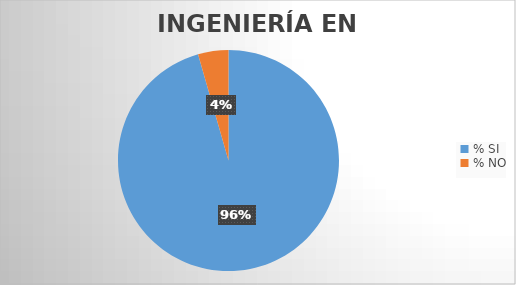
| Category | Series 0 |
|---|---|
| % SI | 95.556 |
| % NO | 4.444 |